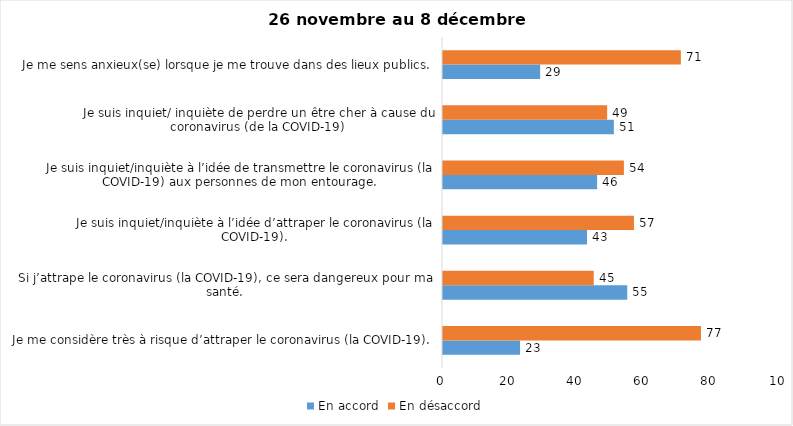
| Category | En accord | En désaccord |
|---|---|---|
| Je me considère très à risque d’attraper le coronavirus (la COVID-19). | 23 | 77 |
| Si j’attrape le coronavirus (la COVID-19), ce sera dangereux pour ma santé. | 55 | 45 |
| Je suis inquiet/inquiète à l’idée d’attraper le coronavirus (la COVID-19). | 43 | 57 |
| Je suis inquiet/inquiète à l’idée de transmettre le coronavirus (la COVID-19) aux personnes de mon entourage. | 46 | 54 |
| Je suis inquiet/ inquiète de perdre un être cher à cause du coronavirus (de la COVID-19) | 51 | 49 |
| Je me sens anxieux(se) lorsque je me trouve dans des lieux publics. | 29 | 71 |